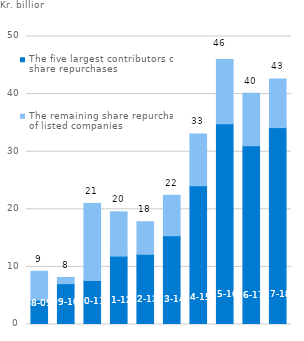
| Category | The five largest contributors of share repurchases | The remaining share repurchases of listed companies |
|---|---|---|
| '08-09 | 4.231 | 5.003 |
| '09-10 | 7.089 | 1.082 |
| '10-11 | 7.62 | 13.372 |
| '11-12 | 11.874 | 7.689 |
| '12-13 | 12.188 | 5.646 |
| '13-14 | 15.409 | 7.015 |
| '14-15 | 24.095 | 8.995 |
| '15-16 | 34.846 | 11.182 |
| '16-17 | 31.026 | 9.113 |
| '17-18 | 34.187 | 8.436 |